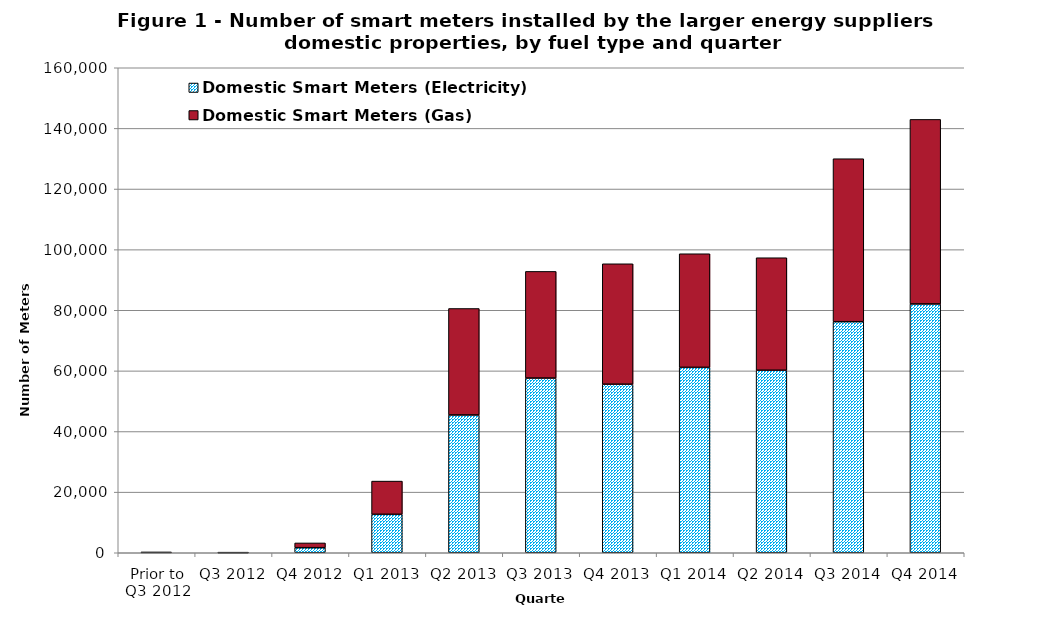
| Category | Domestic Smart Meters (Electricity) | Domestic Smart Meters (Gas) |
|---|---|---|
| Prior to Q3 2012 | 96 | 92 |
| Q3 2012 | 36 | 32 |
| Q4 2012 | 1671 | 1570 |
| Q1 2013 | 12678 | 10963 |
| Q2 2013 | 45456 | 35130 |
| Q3 2013 | 57632 | 35190 |
| Q4 2013 | 55603 | 39730 |
| Q1 2014 | 61164 | 37480 |
| Q2 2014 | 60216 | 37113 |
| Q3 2014 | 76227 | 53764 |
| Q4 2014 | 82081 | 60882 |